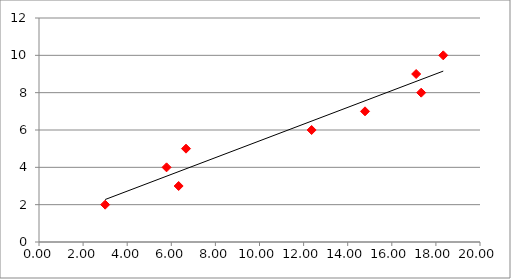
| Category | Series 0 |
|---|---|
| 3.0 | 2 |
| 6.333333333333334 | 3 |
| 5.785714285714286 | 4 |
| 6.666666666666667 | 5 |
| 12.363636363636363 | 6 |
| 14.785714285714285 | 7 |
| 17.333333333333336 | 8 |
| 17.105263157894736 | 9 |
| 18.333333333333332 | 10 |